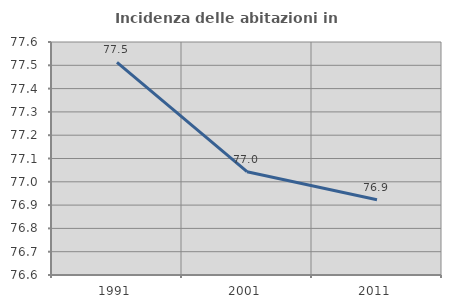
| Category | Incidenza delle abitazioni in proprietà  |
|---|---|
| 1991.0 | 77.513 |
| 2001.0 | 77.043 |
| 2011.0 | 76.923 |